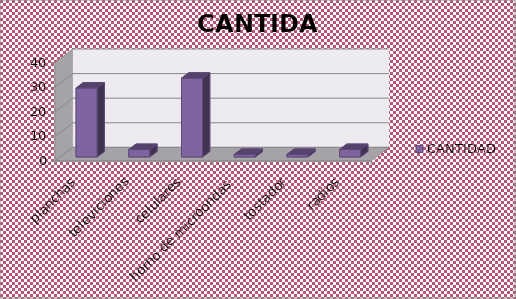
| Category | CANTIDAD |
|---|---|
| planchas | 28 |
| televiciones | 3 |
| celulares | 32 |
| horno de microondas | 1 |
| tostador | 1 |
| radios | 3 |